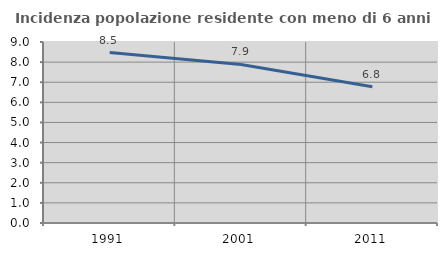
| Category | Incidenza popolazione residente con meno di 6 anni |
|---|---|
| 1991.0 | 8.475 |
| 2001.0 | 7.883 |
| 2011.0 | 6.773 |